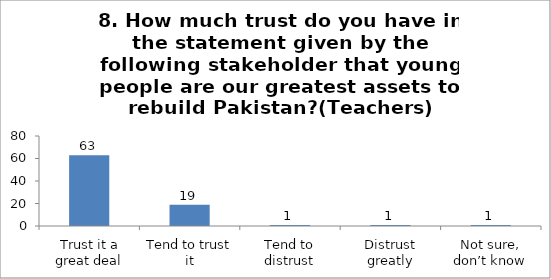
| Category | 8. How much trust do you have in the statement given by the following stakeholder that young people are our greatest assets to rebuild Pakistan?(Teachers) |
|---|---|
| Trust it a great deal | 63 |
| Tend to trust it | 19 |
| Tend to distrust | 1 |
| Distrust greatly | 1 |
| Not sure, don’t know | 1 |